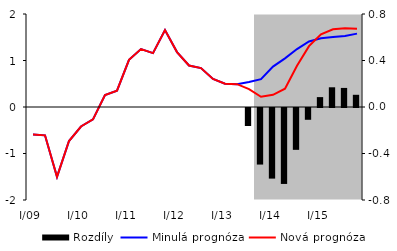
| Category | Rozdíly |
|---|---|
| 0 | 0 |
| 1 | 0 |
| 2 | 0 |
| 3 | 0 |
| 4 | 0 |
| 5 | 0 |
| 6 | 0 |
| 7 | 0 |
| 8 | 0 |
| 9 | 0 |
| 10 | 0 |
| 11 | 0 |
| 12 | 0 |
| 13 | 0 |
| 14 | 0 |
| 15 | 0 |
| 16 | 0 |
| 17 | 0 |
| 18 | -0.155 |
| 19 | -0.487 |
| 20 | -0.607 |
| 21 | -0.653 |
| 22 | -0.36 |
| 23 | -0.101 |
| 24 | 0.085 |
| 25 | 0.17 |
| 26 | 0.164 |
| 27 | 0.105 |